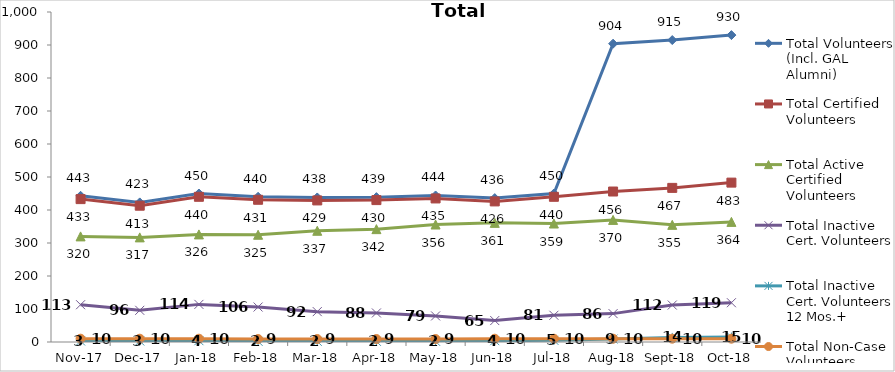
| Category | Total Volunteers (Incl. GAL Alumni) | Total Certified Volunteers | Total Active Certified Volunteers | Total Inactive Cert. Volunteers | Total Inactive Cert. Volunteers 12 Mos.+ | Total Non-Case Volunteers |
|---|---|---|---|---|---|---|
| 2017-11-01 | 443 | 433 | 320 | 113 | 3 | 10 |
| 2017-12-01 | 423 | 413 | 317 | 96 | 3 | 10 |
| 2018-01-01 | 450 | 440 | 326 | 114 | 4 | 10 |
| 2018-02-01 | 440 | 431 | 325 | 106 | 2 | 9 |
| 2018-03-01 | 438 | 429 | 337 | 92 | 2 | 9 |
| 2018-04-01 | 439 | 430 | 342 | 88 | 2 | 9 |
| 2018-05-01 | 444 | 435 | 356 | 79 | 2 | 9 |
| 2018-06-01 | 436 | 426 | 361 | 65 | 4 | 10 |
| 2018-07-01 | 450 | 440 | 359 | 81 | 5 | 10 |
| 2018-08-01 | 904 | 456 | 370 | 86 | 9 | 10 |
| 2018-09-01 | 915 | 467 | 355 | 112 | 14 | 10 |
| 2018-10-01 | 930 | 483 | 364 | 119 | 15 | 10 |